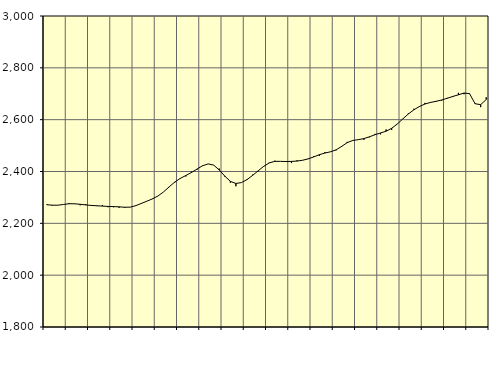
| Category | Piggar | Series 1 |
|---|---|---|
| nan | 2273.8 | 2271.77 |
| 1.0 | 2267.9 | 2270.03 |
| 1.0 | 2269.6 | 2269.9 |
| 1.0 | 2273.1 | 2272.82 |
| nan | 2278.4 | 2275.63 |
| 2.0 | 2276.4 | 2275.38 |
| 2.0 | 2269.6 | 2273.46 |
| 2.0 | 2274.4 | 2271.05 |
| nan | 2267.1 | 2269.06 |
| 3.0 | 2266.6 | 2267.84 |
| 3.0 | 2270.9 | 2266.48 |
| 3.0 | 2262.2 | 2265.31 |
| nan | 2262 | 2264.55 |
| 4.0 | 2260.1 | 2263.58 |
| 4.0 | 2259.2 | 2262.07 |
| 4.0 | 2262.1 | 2262.53 |
| nan | 2269.7 | 2268.18 |
| 5.0 | 2278.4 | 2276.81 |
| 5.0 | 2285.1 | 2285.49 |
| 5.0 | 2295.4 | 2294.43 |
| nan | 2305.7 | 2305.68 |
| 6.0 | 2321.4 | 2321.31 |
| 6.0 | 2339.8 | 2340.73 |
| 6.0 | 2357.2 | 2359.17 |
| nan | 2374.8 | 2373.47 |
| 7.0 | 2380.9 | 2384.58 |
| 7.0 | 2399.4 | 2395.91 |
| 7.0 | 2406.8 | 2409.35 |
| nan | 2423.3 | 2422.09 |
| 8.0 | 2429.3 | 2429.31 |
| 8.0 | 2424.2 | 2424.59 |
| 8.0 | 2411.2 | 2406.08 |
| nan | 2379.9 | 2382.31 |
| 9.0 | 2356.6 | 2362 |
| 9.0 | 2343.1 | 2353.82 |
| 9.0 | 2357.2 | 2357.24 |
| nan | 2367.1 | 2368.87 |
| 10.0 | 2387.9 | 2384.96 |
| 10.0 | 2400.6 | 2402.68 |
| 10.0 | 2418.4 | 2419.98 |
| nan | 2434.7 | 2433.2 |
| 11.0 | 2441.8 | 2439.12 |
| 11.0 | 2438.9 | 2439.17 |
| 11.0 | 2436.8 | 2438.5 |
| nan | 2432.5 | 2438.92 |
| 12.0 | 2443.4 | 2440.23 |
| 12.0 | 2443 | 2443.45 |
| 12.0 | 2450.1 | 2448.75 |
| nan | 2459.3 | 2456.39 |
| 13.0 | 2460 | 2464.92 |
| 13.0 | 2474.8 | 2471.25 |
| 13.0 | 2476.6 | 2475.98 |
| nan | 2481.6 | 2483.48 |
| 14.0 | 2494.4 | 2496.75 |
| 14.0 | 2514.4 | 2511.22 |
| 14.0 | 2520.9 | 2519.69 |
| nan | 2522.3 | 2522.95 |
| 15.0 | 2522.3 | 2526.89 |
| 15.0 | 2531.9 | 2533.88 |
| 15.0 | 2545.2 | 2541.92 |
| nan | 2543.4 | 2548.67 |
| 16.0 | 2562.2 | 2555.49 |
| 16.0 | 2560.3 | 2566.67 |
| 16.0 | 2583.7 | 2583.04 |
| nan | 2602.5 | 2602.87 |
| 17.0 | 2624.4 | 2622.05 |
| 17.0 | 2642.1 | 2638.06 |
| 17.0 | 2649.2 | 2650.87 |
| nan | 2664.8 | 2660.47 |
| 18.0 | 2664.5 | 2666.54 |
| 18.0 | 2668.8 | 2670.85 |
| 18.0 | 2673.7 | 2675.99 |
| nan | 2684.2 | 2682.63 |
| 19.0 | 2687.1 | 2689.7 |
| 19.0 | 2703.5 | 2695.85 |
| 19.0 | 2698.1 | 2702.8 |
| nan | 2701.8 | 2700.51 |
| 20.0 | 2663.6 | 2661.45 |
| 20.0 | 2648.3 | 2657.97 |
| 20.0 | 2686.2 | 2677.77 |